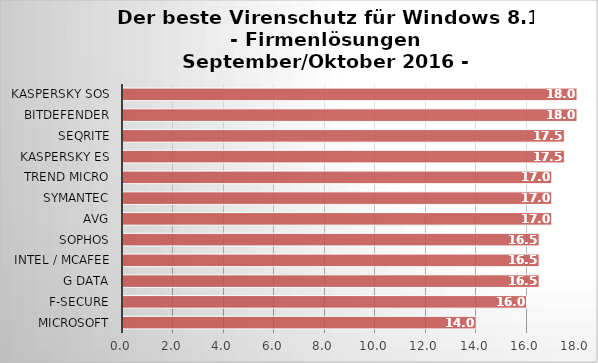
| Category | Series 0 |
|---|---|
| Microsoft | 14 |
| F-Secure | 16 |
| G Data | 16.5 |
| Intel / McAfee | 16.5 |
| Sophos | 16.5 |
| AVG | 17 |
| Symantec | 17 |
| Trend Micro | 17 |
| Kaspersky ES | 17.5 |
| Seqrite | 17.5 |
| Bitdefender | 18 |
| Kaspersky SOS | 18 |